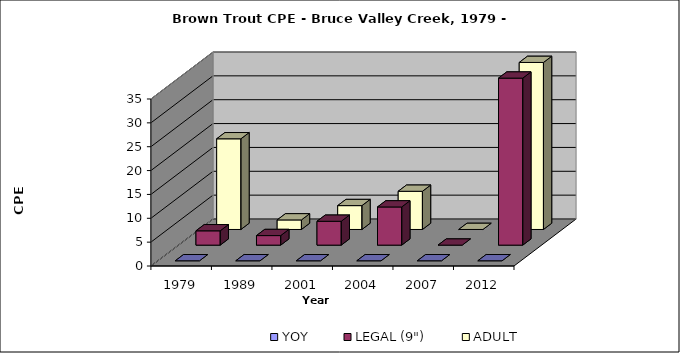
| Category | YOY | LEGAL (9") | ADULT |
|---|---|---|---|
| 1979.0 | 0 | 3 | 19 |
| 1989.0 | 0 | 2 | 2 |
| 2001.0 | 0 | 5 | 5 |
| 2004.0 | 0 | 8 | 8 |
| 2007.0 | 0 | 0 | 0 |
| 2012.0 | 0 | 35 | 35 |